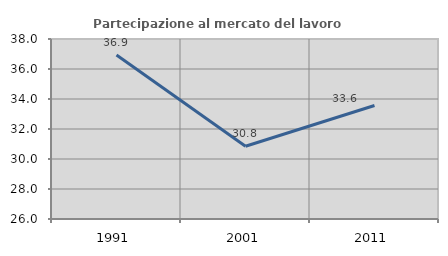
| Category | Partecipazione al mercato del lavoro  femminile |
|---|---|
| 1991.0 | 36.929 |
| 2001.0 | 30.848 |
| 2011.0 | 33.57 |